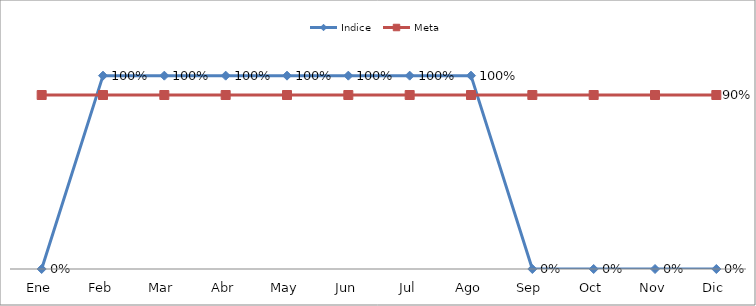
| Category | Indice | Meta |
|---|---|---|
| Ene | 0 | 0.9 |
| Feb | 1 | 0.9 |
| Mar | 1 | 0.9 |
| Abr | 1 | 0.9 |
| May | 1 | 0.9 |
| Jun | 1 | 0.9 |
| Jul | 1 | 0.9 |
| Ago | 1 | 0.9 |
| Sep | 0 | 0.9 |
| Oct | 0 | 0.9 |
| Nov | 0 | 0.9 |
| Dic | 0 | 0.9 |